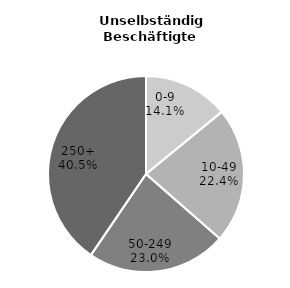
| Category | Series 0 |
|---|---|
| 0-9 | 359668 |
| 10-49 | 572052 |
| 50-249 | 588902 |
| 250+ | 1035313 |